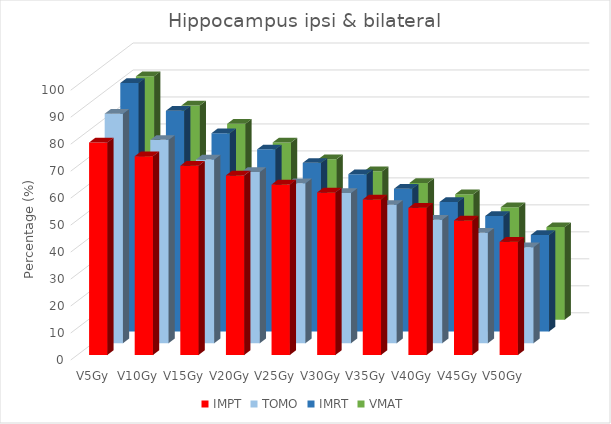
| Category | IMPT | TOMO | IMRT | VMAT |
|---|---|---|---|---|
| V5Gy | 78.8 | 85.1 | 92.1 | 90.2 |
| V10Gy | 73.7 | 75.4 | 81.8 | 79.4 |
| V15Gy | 70.2 | 68.1 | 73.5 | 72.6 |
| V20Gy | 66.6 | 63.5 | 67.5 | 65.7 |
| V25Gy | 63.2 | 59.3 | 62.5 | 59.5 |
| V30Gy | 60.3 | 55.7 | 58.3 | 55 |
| V35Gy | 57.7 | 51.3 | 52.9 | 50.7 |
| V40Gy | 54.6 | 45.8 | 48 | 46.5 |
| V45Gy | 49.9 | 41 | 42.8 | 41.7 |
| V50Gy | 42 | 35.6 | 35.8 | 34.3 |